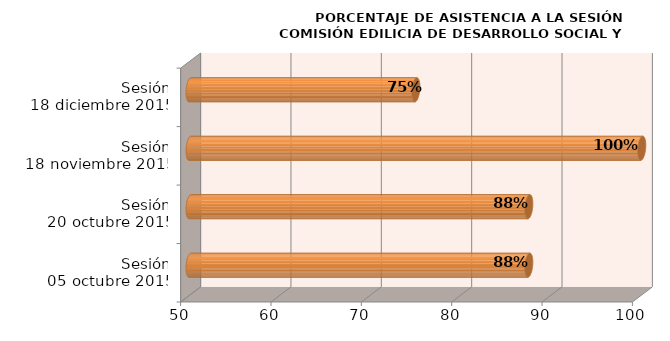
| Category | Series 0 |
|---|---|
| Sesión
05 octubre 2015 | 87.5 |
| Sesión
20 octubre 2015 | 87.5 |
| Sesión
18 noviembre 2015 | 100 |
| Sesión
18 diciembre 2015 | 75 |